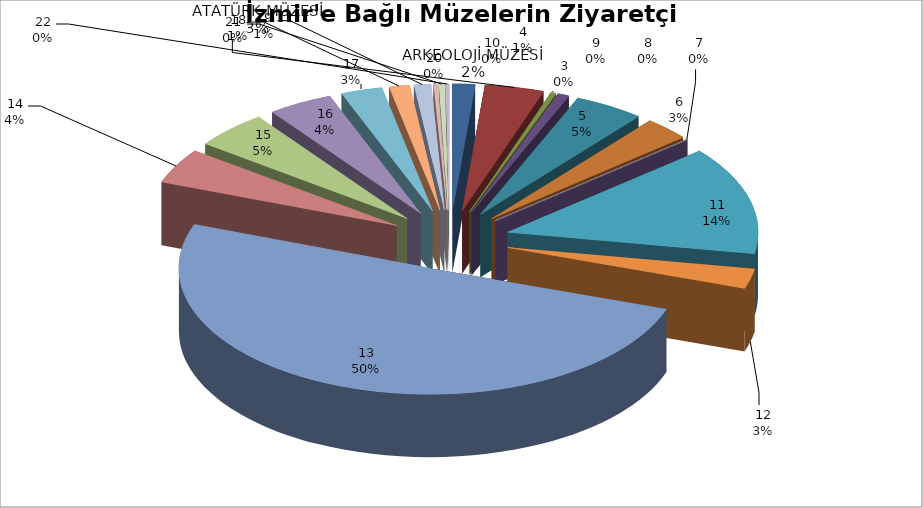
| Category | Series 0 |
|---|---|
| 0 | 43547 |
| 1 | 114304 |
| 2 | 10275 |
| 3 | 22230 |
| 4 | 135531 |
| 5 | 89162 |
| 6 | 1013 |
| 7 | 0 |
| 8 | 0 |
| 9 | 0 |
| 10 | 416062 |
| 11 | 75855 |
| 12 | 1511290 |
| 13 | 134379 |
| 14 | 144281 |
| 15 | 125647 |
| 16 | 79734 |
| 17 | 39390 |
| 18 | 32627 |
| 19 | 7918 |
| 20 | 10706 |
| 21 | 6912 |